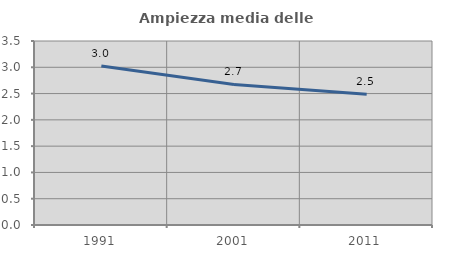
| Category | Ampiezza media delle famiglie |
|---|---|
| 1991.0 | 3.024 |
| 2001.0 | 2.673 |
| 2011.0 | 2.488 |